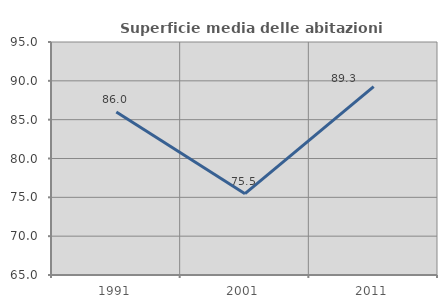
| Category | Superficie media delle abitazioni occupate |
|---|---|
| 1991.0 | 85.989 |
| 2001.0 | 75.466 |
| 2011.0 | 89.263 |